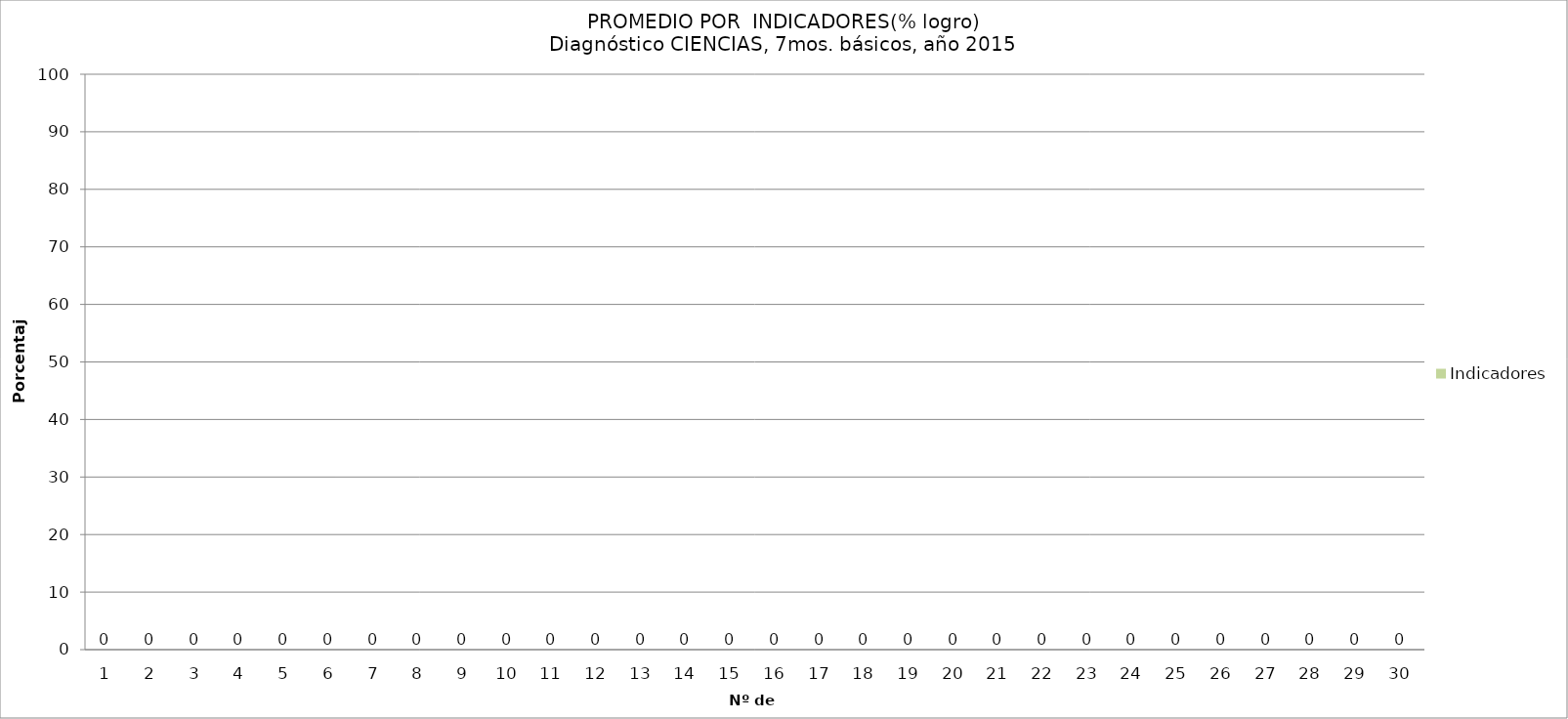
| Category | Indicadores |
|---|---|
| 0 | 0 |
| 1 | 0 |
| 2 | 0 |
| 3 | 0 |
| 4 | 0 |
| 5 | 0 |
| 6 | 0 |
| 7 | 0 |
| 8 | 0 |
| 9 | 0 |
| 10 | 0 |
| 11 | 0 |
| 12 | 0 |
| 13 | 0 |
| 14 | 0 |
| 15 | 0 |
| 16 | 0 |
| 17 | 0 |
| 18 | 0 |
| 19 | 0 |
| 20 | 0 |
| 21 | 0 |
| 22 | 0 |
| 23 | 0 |
| 24 | 0 |
| 25 | 0 |
| 26 | 0 |
| 27 | 0 |
| 28 | 0 |
| 29 | 0 |